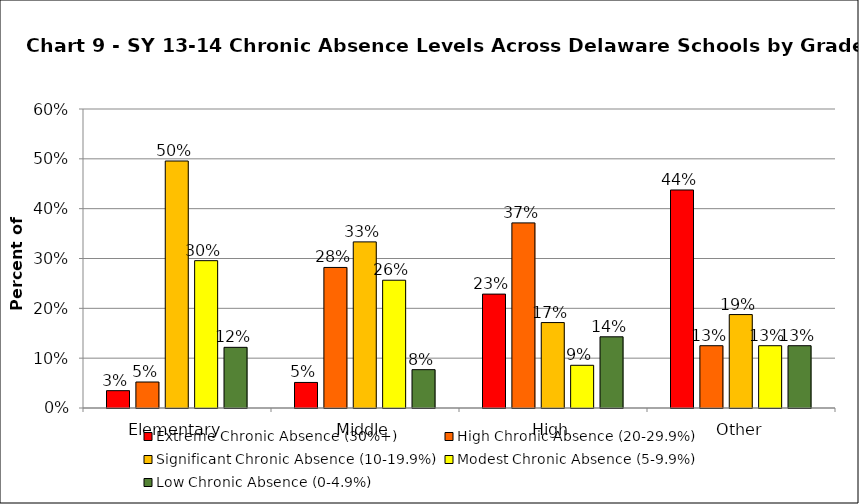
| Category | Extreme Chronic Absence (30%+) | High Chronic Absence (20-29.9%) | Significant Chronic Absence (10-19.9%) | Modest Chronic Absence (5-9.9%) | Low Chronic Absence (0-4.9%) |
|---|---|---|---|---|---|
| 0 | 0.035 | 0.052 | 0.496 | 0.296 | 0.122 |
| 1 | 0.051 | 0.282 | 0.333 | 0.256 | 0.077 |
| 2 | 0.229 | 0.371 | 0.171 | 0.086 | 0.143 |
| 3 | 0.438 | 0.125 | 0.188 | 0.125 | 0.125 |